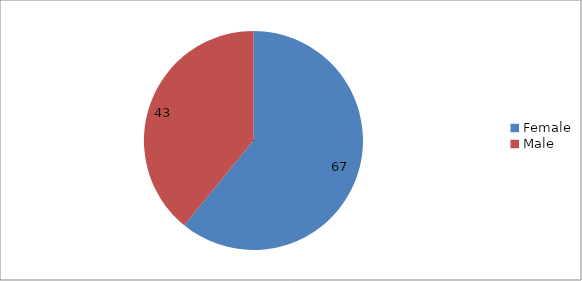
| Category | Series 0 |
|---|---|
| Female | 67 |
| Male | 43 |